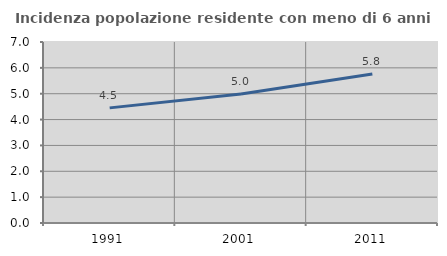
| Category | Incidenza popolazione residente con meno di 6 anni |
|---|---|
| 1991.0 | 4.452 |
| 2001.0 | 4.992 |
| 2011.0 | 5.766 |